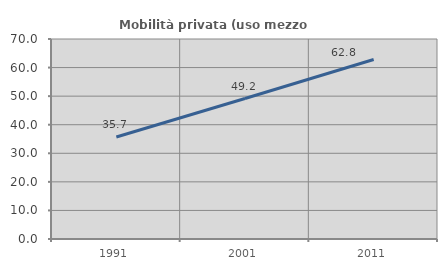
| Category | Mobilità privata (uso mezzo privato) |
|---|---|
| 1991.0 | 35.714 |
| 2001.0 | 49.169 |
| 2011.0 | 62.834 |